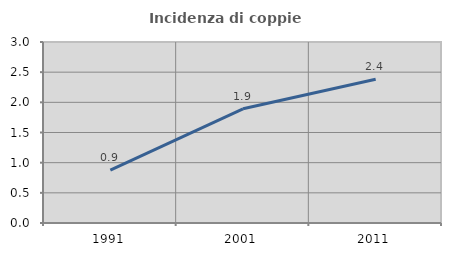
| Category | Incidenza di coppie miste |
|---|---|
| 1991.0 | 0.876 |
| 2001.0 | 1.893 |
| 2011.0 | 2.382 |